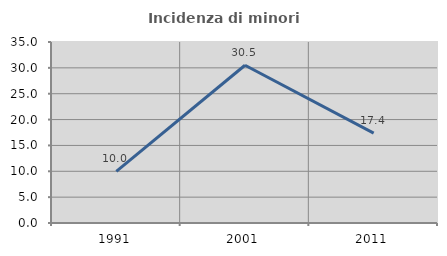
| Category | Incidenza di minori stranieri |
|---|---|
| 1991.0 | 10 |
| 2001.0 | 30.508 |
| 2011.0 | 17.365 |